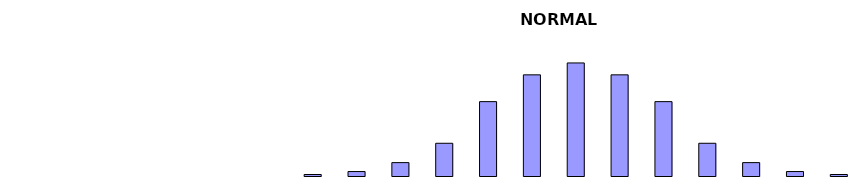
| Category | Series 0 |
|---|---|
| 0 | 1 |
| 1 | 3 |
| 2 | 9 |
| 3 | 22 |
| 4 | 50 |
| 5 | 68 |
| 6 | 76 |
| 7 | 68 |
| 8 | 50 |
| 9 | 22 |
| 10 | 9 |
| 11 | 3 |
| 12 | 1 |